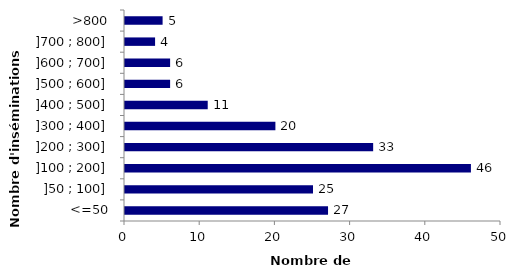
| Category | Series 0 |
|---|---|
| <=50 | 27 |
| ]50 ; 100] | 25 |
| ]100 ; 200] | 46 |
| ]200 ; 300] | 33 |
| ]300 ; 400] | 20 |
| ]400 ; 500] | 11 |
| ]500 ; 600] | 6 |
| ]600 ; 700] | 6 |
| ]700 ; 800] | 4 |
| >800 | 5 |